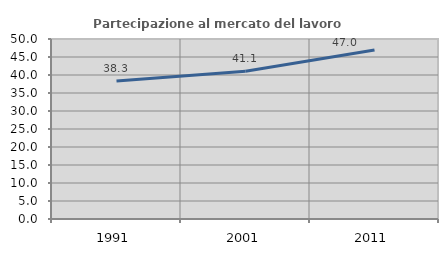
| Category | Partecipazione al mercato del lavoro  femminile |
|---|---|
| 1991.0 | 38.306 |
| 2001.0 | 41.057 |
| 2011.0 | 46.964 |